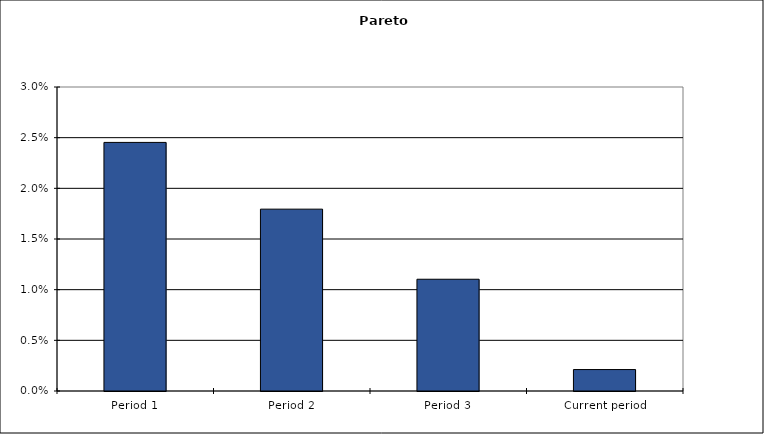
| Category | Problem 1 |
|---|---|
| Period 1 | 0.025 |
| Period 2 | 0.018 |
| Period 3 | 0.011 |
| Current period | 0.002 |